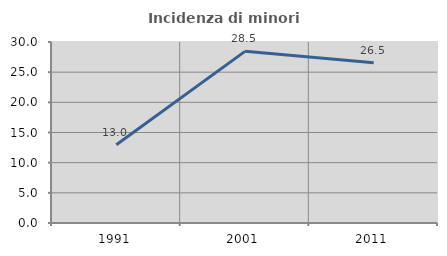
| Category | Incidenza di minori stranieri |
|---|---|
| 1991.0 | 12.963 |
| 2001.0 | 28.452 |
| 2011.0 | 26.543 |